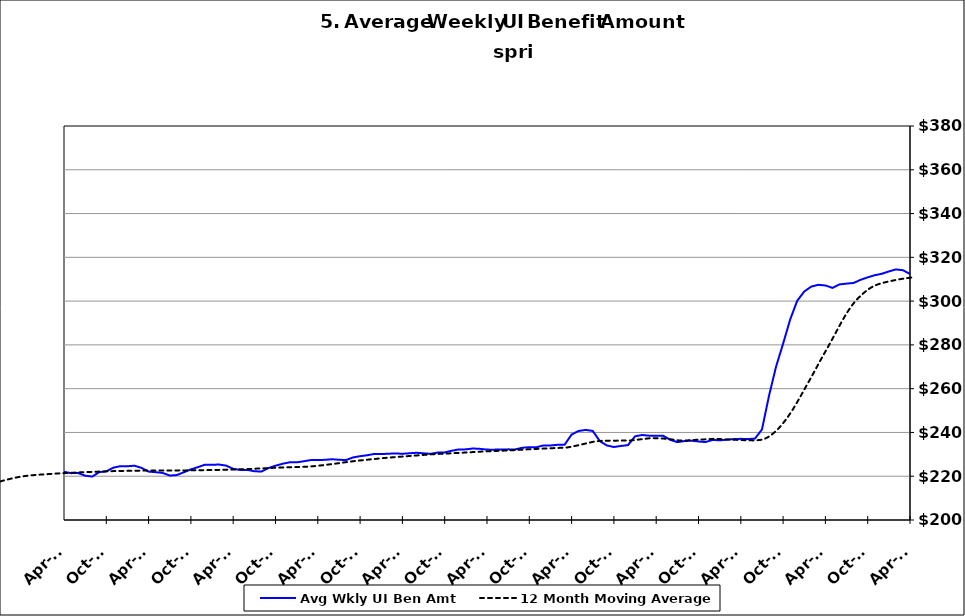
| Category | Avg Wkly UI Ben Amt |
|---|---|
| 1995-01-31 | 152.517 |
| 1995-02-28 | 151.164 |
| 1995-03-31 | 148.4 |
| 1995-04-30 | 146.034 |
| 1995-05-31 | 146.738 |
| 1995-06-30 | 147.885 |
| 1995-07-31 | 145.798 |
| 1995-08-31 | 144.052 |
| 1995-09-30 | 147.334 |
| 1995-10-31 | 151.535 |
| 1995-11-30 | 152.903 |
| 1995-12-31 | 153.258 |
| 1996-01-15 | 153.468 |
| 1996-02-15 | 153.032 |
| 1996-03-15 | 155.453 |
| 1996-04-15 | 148.614 |
| 1996-05-15 | 148.648 |
| 1996-06-15 | 150.145 |
| 1996-07-15 | 147.052 |
| 1996-08-15 | 146.042 |
| 1996-09-15 | 149.978 |
| 1996-10-15 | 151.319 |
| 1996-11-15 | 153.295 |
| 1996-12-15 | 155.775 |
| 1997-01-15 | 154.813 |
| 1997-02-15 | 151.102 |
| 1997-03-15 | 149.222 |
| 1997-04-15 | 145.178 |
| 1997-05-31 | 145.194 |
| 1997-06-30 | 146.718 |
| 1997-07-31 | 142.224 |
| 1997-08-31 | 142.382 |
| 1997-09-30 | 143.123 |
| 1997-10-31 | 146.797 |
| 1997-11-30 | 148.163 |
| 1997-12-31 | 147.967 |
| 1998-01-31 | 147.87 |
| 1998-02-28 | 147.591 |
| 1998-03-31 | 147.262 |
| 1998-04-30 | 144.746 |
| 1998-05-31 | 146.093 |
| 1998-06-30 | 147.355 |
| 1998-07-31 | 146.079 |
| 1998-08-31 | 147.387 |
| 1998-09-30 | 147.529 |
| 1998-10-31 | 152.825 |
| 1998-11-30 | 156.171 |
| 1998-12-31 | 156.424 |
| 1999-01-31 | 157.388 |
| 1999-02-28 | 157.868 |
| 1999-03-31 | 157.505 |
| 1999-04-30 | 153.987 |
| 1999-05-31 | 153.665 |
| 1999-06-30 | 153.746 |
| 1999-07-31 | 154.09 |
| 1999-08-31 | 156.162 |
| 1999-09-30 | 157.136 |
| 1999-10-31 | 162.476 |
| 1999-11-30 | 163.291 |
| 1999-12-31 | 165.621 |
| 2000-01-31 | 166.425 |
| 2000-02-29 | 165.378 |
| 2000-03-31 | 163.05 |
| 2000-04-30 | 161.908 |
| 2000-05-31 | 160.484 |
| 2000-06-30 | 160.865 |
| 2000-07-31 | 161.011 |
| 2000-08-31 | 158.845 |
| 2000-09-30 | 161.127 |
| 2000-10-31 | 163.997 |
| 2000-11-30 | 164.759 |
| 2000-12-31 | 166.66 |
| 2001-01-31 | 168.164 |
| 2001-02-28 | 169.339 |
| 2001-03-31 | 169.617 |
| 2001-04-30 | 170.349 |
| 2001-05-31 | 168.417 |
| 2001-06-30 | 169.418 |
| 2001-07-31 | 169.733 |
| 2001-08-31 | 170.578 |
| 2001-09-30 | 174.36 |
| 2001-10-31 | 176.952 |
| 2001-11-30 | 178.489 |
| 2001-12-31 | 179.805 |
| 2002-01-31 | 179.529 |
| 2002-02-28 | 179.269 |
| 2002-03-31 | 178.588 |
| 2002-04-30 | 177.594 |
| 2002-05-31 | 175.021 |
| 2002-06-30 | 175.298 |
| 2002-07-31 | 173.853 |
| 2002-08-31 | 172.776 |
| 2002-09-30 | 174.657 |
| 2002-10-31 | 175.648 |
| 2002-11-30 | 176.299 |
| 2002-12-31 | 177.239 |
| 2003-01-31 | 176.943 |
| 2003-02-28 | 176.988 |
| 2003-03-31 | 175.698 |
| 2003-04-30 | 172.857 |
| 2003-05-31 | 171.934 |
| 2003-06-30 | 171.956 |
| 2003-07-31 | 170.949 |
| 2003-08-31 | 171.311 |
| 2003-09-30 | 171.909 |
| 2003-10-31 | 172.692 |
| 2003-11-30 | 173.689 |
| 2003-12-31 | 174.176 |
| 2004-01-31 | 173.867 |
| 2004-02-29 | 173.648 |
| 2004-03-31 | 172.152 |
| 2004-04-30 | 170.705 |
| 2004-05-31 | 170.684 |
| 2004-06-30 | 170.635 |
| 2004-07-31 | 171.229 |
| 2004-08-31 | 175.375 |
| 2004-09-30 | 182.737 |
| 2004-10-31 | 187.554 |
| 2004-11-30 | 191.316 |
| 2004-12-31 | 194.602 |
| 2005-01-31 | 196.38 |
| 2005-02-28 | 196.569 |
| 2005-03-31 | 195.523 |
| 2005-04-30 | 193.655 |
| 2005-05-31 | 193.953 |
| 2005-06-30 | 192.728 |
| 2005-07-31 | 192.211 |
| 2005-08-31 | 191.133 |
| 2005-09-30 | 194.339 |
| 2005-10-31 | 196.819 |
| 2005-11-30 | 198.473 |
| 2005-12-31 | 199.545 |
| 2006-01-31 | 199.965 |
| 2006-02-28 | 200.117 |
| 2006-03-31 | 198.335 |
| 2006-04-30 | 197.258 |
| 2006-05-31 | 195.225 |
| 2006-06-30 | 195.734 |
| 2006-07-31 | 194.92 |
| 2006-08-31 | 194.282 |
| 2006-09-30 | 196.801 |
| 2006-10-31 | 199.137 |
| 2006-11-30 | 201.183 |
| 2006-12-31 | 202.121 |
| 2007-01-31 | 202.615 |
| 2007-02-28 | 202.465 |
| 2007-03-31 | 201.75 |
| 2007-04-30 | 200.344 |
| 2007-05-31 | 198.851 |
| 2007-06-30 | 198.258 |
| 2007-07-30 | 197.654 |
| 2007-08-31 | 198.405 |
| 2007-09-30 | 200.563 |
| 2007-10-31 | 201.857 |
| 2007-11-15 | 203.345 |
| 2007-12-15 09:36:00 | 219.243 |
| 2008-01-14 19:12:00 | 219.658 |
| 2008-02-14 04:48:00 | 220.121 |
| 2008-03-15 14:24:00 | 219.456 |
| 2008-04-15 | 217.672 |
| 2008-05-15 09:36:00 | 216.637 |
| 2008-06-14 19:12:00 | 216.035 |
| 2008-07-15 04:48:00 | 213.916 |
| 2008-08-14 14:24:00 | 214.008 |
| 2008-09-14 | 216.475 |
| 2008-10-14 09:36:00 | 217.836 |
| 2008-11-13 19:12:00 | 219.819 |
| 2008-12-14 04:48:00 | 221.529 |
| 2009-01-13 14:24:00 | 222.143 |
| 2009-02-13 | 222.091 |
| 2009-03-15 09:36:00 | 222.273 |
| 2009-04-14 19:12:00 | 222.011 |
| 2009-05-15 04:48:00 | 221.558 |
| 2009-06-14 14:24:00 | 220.761 |
| 2009-07-15 | 219.225 |
| 2009-08-14 09:36:00 | 218.364 |
| 2009-09-13 19:12:00 | 218.814 |
| 2009-10-14 04:48:00 | 218.744 |
| 2009-11-13 14:24:00 | 218.719 |
| 2009-12-14 | 218.779 |
| 2010-01-13 09:36:00 | 217.988 |
| 2010-02-12 19:12:00 | 217.521 |
| 2010-03-15 04:48:00 | 216.93 |
| 2010-04-14 14:24:00 | 215.638 |
| 2010-05-15 | 213.953 |
| 2010-06-14 09:36:00 | 213.326 |
| 2010-07-14 19:12:00 | 211.48 |
| 2010-08-14 04:48:00 | 210.615 |
| 2010-09-13 14:24:00 | 211.554 |
| 2010-10-14 | 211.956 |
| 2010-11-13 09:36:00 | 212.619 |
| 2010-12-13 19:12:00 | 212.979 |
| 2011-01-13 04:48:00 | 212.778 |
| 2011-02-12 14:24:00 | 212.812 |
| 2011-03-15 | 212.631 |
| 2011-04-14 09:36:00 | 211.659 |
| 2011-05-14 19:12:00 | 210.522 |
| 2011-06-14 04:48:00 | 209.652 |
| 2011-07-14 14:24:00 | 208.005 |
| 2011-08-14 | 207.451 |
| 2011-09-13 09:36:00 | 209.173 |
| 2011-10-13 19:12:00 | 209.736 |
| 2011-11-13 04:48:00 | 211.422 |
| 2011-12-13 14:24:00 | 212.679 |
| 2012-01-13 | 212.502 |
| 2012-02-12 09:36:00 | 212.715 |
| 2012-03-13 19:12:00 | 212.846 |
| 2012-04-13 04:48:00 | 212.323 |
| 2012-05-13 14:24:00 | 210.934 |
| 2012-06-13 | 210.073 |
| 2012-07-13 09:36:00 | 208.192 |
| 2012-08-12 19:12:00 | 208.902 |
| 2012-09-12 04:48:00 | 211.616 |
| 2012-10-12 14:24:00 | 214.814 |
| 2012-11-12 | 218.296 |
| 2012-12-12 09:36:00 | 220.532 |
| 2013-01-11 19:12:00 | 221.653 |
| 2013-02-11 04:48:00 | 221.49 |
| 2013-03-13 14:24:00 | 220.877 |
| 2013-04-13 | 220.198 |
| 2013-05-13 09:36:00 | 219.395 |
| 2013-06-12 19:12:00 | 219.716 |
| 2013-07-13 04:48:00 | 218.588 |
| 2013-08-12 14:24:00 | 218.444 |
| 2013-09-12 | 220.248 |
| 2013-10-12 09:36:00 | 221.094 |
| 2013-11-11 19:12:00 | 222.471 |
| 2013-12-12 04:48:00 | 223.964 |
| 2014-01-11 14:24:00 | 224.183 |
| 2014-02-11 | 224.065 |
| 2014-03-13 09:36:00 | 223.376 |
| 2014-04-12 19:12:00 | 222.017 |
| 2014-05-13 04:48:00 | 221.409 |
| 2014-06-12 14:24:00 | 221.458 |
| 2014-07-13 | 220.256 |
| 2014-08-12 09:36:00 | 219.823 |
| 2014-09-11 19:12:00 | 221.87 |
| 2014-10-12 04:48:00 | 222.223 |
| 2014-11-11 14:24:00 | 223.919 |
| 2014-12-12 | 224.606 |
| 2015-01-11 09:36:00 | 224.554 |
| 2015-02-10 19:12:00 | 224.808 |
| 2015-03-13 04:48:00 | 223.795 |
| 2015-04-12 14:24:00 | 222.11 |
| 2015-05-13 | 221.845 |
| 2015-06-12 09:36:00 | 221.492 |
| 2015-07-12 19:12:00 | 220.308 |
| 2015-08-12 04:48:00 | 220.534 |
| 2015-09-11 14:24:00 | 221.819 |
| 2015-10-12 | 223.117 |
| 2015-11-11 09:36:00 | 224.146 |
| 2015-12-11 19:12:00 | 225.264 |
| 2016-01-11 04:48:00 | 225.247 |
| 2016-02-10 14:24:00 | 225.331 |
| 2016-03-12 | 224.849 |
| 2016-04-11 09:36:00 | 223.376 |
| 2016-05-11 19:12:00 | 222.856 |
| 2016-06-11 04:48:00 | 222.895 |
| 2016-07-11 14:24:00 | 222.285 |
| 2016-08-11 | 222.119 |
| 2016-09-10 09:36:00 | 223.72 |
| 2016-10-10 19:12:00 | 224.805 |
| 2016-11-10 04:48:00 | 225.687 |
| 2016-12-10 14:24:00 | 226.349 |
| 2017-01-10 | 226.348 |
| 2017-02-09 09:36:00 | 226.816 |
| 2017-03-11 19:12:00 | 227.395 |
| 2017-04-11 04:48:00 | 227.37 |
| 2017-05-11 14:24:00 | 227.492 |
| 2017-06-11 | 227.755 |
| 2017-07-11 09:36:00 | 227.522 |
| 2017-08-10 19:12:00 | 227.382 |
| 2017-09-10 04:48:00 | 228.581 |
| 2017-10-10 14:24:00 | 229.154 |
| 2017-11-10 | 229.58 |
| 2017-12-10 09:36:00 | 230.186 |
| 2018-01-09 19:12:00 | 230.136 |
| 2018-02-09 04:48:00 | 230.265 |
| 2018-03-11 14:24:00 | 230.427 |
| 2018-04-11 | 230.25 |
| 2018-05-11 09:36:00 | 230.487 |
| 2018-06-10 19:12:00 | 230.714 |
| 2018-07-11 04:48:00 | 230.457 |
| 2018-08-10 14:24:00 | 230.244 |
| 2018-09-10 | 230.802 |
| 2018-10-10 09:36:00 | 230.887 |
| 2018-11-09 19:12:00 | 231.636 |
| 2018-12-10 04:48:00 | 232.24 |
| 2019-01-09 14:24:00 | 232.268 |
| 2019-02-09 | 232.662 |
| 2019-03-11 09:36:00 | 232.508 |
| 2019-04-10 19:12:00 | 232.152 |
| 2019-05-11 04:48:00 | 232.145 |
| 2019-06-10 14:24:00 | 232.186 |
| 2019-07-11 | 232.27 |
| 2019-08-10 09:36:00 | 232.238 |
| 2019-09-09 19:12:00 | 232.999 |
| 2019-10-10 04:48:00 | 233.25 |
| 2019-11-09 14:24:00 | 233.231 |
| 2019-12-10 | 234.074 |
| 2020-01-09 09:36:00 | 234.041 |
| 2020-02-08 19:12:00 | 234.352 |
| 2020-03-10 04:48:00 | 234.377 |
| 2020-04-09 14:24:00 | 239.041 |
| 2020-05-10 | 240.685 |
| 2020-06-09 09:36:00 | 241.153 |
| 2020-07-09 19:12:00 | 240.685 |
| 2020-08-09 04:48:00 | 236.032 |
| 2020-09-08 14:24:00 | 234.062 |
| 2020-10-09 | 233.35 |
| 2020-11-08 09:36:00 | 233.83 |
| 2020-12-08 19:12:00 | 234.208 |
| 2021-01-08 04:48:00 | 238.23 |
| 2021-02-07 14:24:00 | 238.83 |
| 2021-03-10 | 238.528 |
| 2021-04-09 09:36:00 | 238.456 |
| 2021-05-09 19:12:00 | 238.445 |
| 2021-06-09 04:48:00 | 236.633 |
| 2021-07-09 14:24:00 | 235.568 |
| 2021-08-09 | 236.063 |
| 2021-09-08 09:36:00 | 236.227 |
| 2021-10-08 19:12:00 | 235.874 |
| 2021-11-08 04:48:00 | 235.609 |
| 2021-12-08 14:24:00 | 236.585 |
| 2022-01-08 | 236.385 |
| 2022-02-07 09:36:00 | 236.701 |
| 2022-03-09 19:12:00 | 236.956 |
| 2022-04-09 04:48:00 | 237.085 |
| 2022-05-09 14:24:00 | 236.985 |
| 2022-06-09 | 237.182 |
| 2022-07-09 09:36:00 | 241.326 |
| 2022-08-08 19:12:00 | 256.732 |
| 2022-09-08 04:48:00 | 270.047 |
| 2022-10-08 14:24:00 | 280.558 |
| 2022-11-08 | 291.58 |
| 2022-12-08 09:36:00 | 300.147 |
| 2023-01-07 19:12:00 | 304.384 |
| 2023-02-07 04:48:00 | 306.643 |
| 2023-03-09 14:24:00 | 307.431 |
| 2023-04-09 | 307.14 |
| 2023-05-09 09:36:00 | 306.055 |
| 2023-06-08 19:12:00 | 307.634 |
| 2023-07-09 04:48:00 | 307.988 |
| 2023-08-08 14:24:00 | 308.295 |
| 2023-09-08 | 309.743 |
| 2023-10-08 09:36:00 | 310.856 |
| 2023-11-07 19:12:00 | 311.833 |
| 2023-12-08 04:48:00 | 312.49 |
| 2024-01-07 14:24:00 | 313.561 |
| 2024-02-07 | 314.483 |
| 2024-03-08 09:36:00 | 314.113 |
| 2024-04-07 19:12:00 | 312.389 |